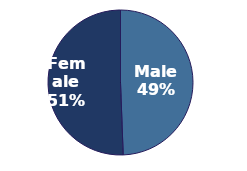
| Category | Series 0 |
|---|---|
| 0 | 0.494 |
| 1 | 0.506 |